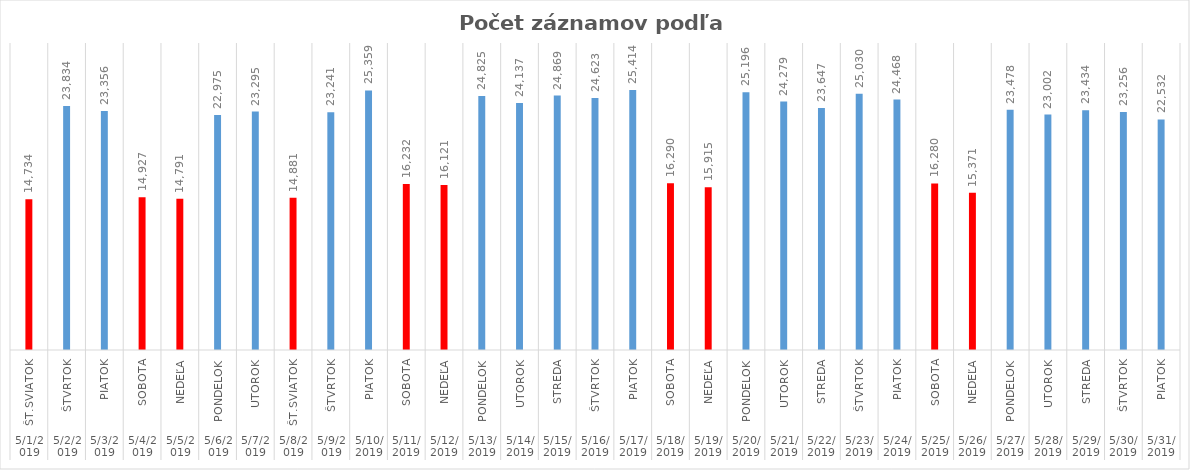
| Category | počet záznamov |
|---|---|
| 0 | 14734 |
| 1 | 23834 |
| 2 | 23356 |
| 3 | 14927 |
| 4 | 14791 |
| 5 | 22975 |
| 6 | 23295 |
| 7 | 14881 |
| 8 | 23241 |
| 9 | 25359 |
| 10 | 16232 |
| 11 | 16121 |
| 12 | 24825 |
| 13 | 24137 |
| 14 | 24869 |
| 15 | 24623 |
| 16 | 25414 |
| 17 | 16290 |
| 18 | 15915 |
| 19 | 25196 |
| 20 | 24279 |
| 21 | 23647 |
| 22 | 25030 |
| 23 | 24468 |
| 24 | 16280 |
| 25 | 15371 |
| 26 | 23478 |
| 27 | 23002 |
| 28 | 23434 |
| 29 | 23256 |
| 30 | 22532 |